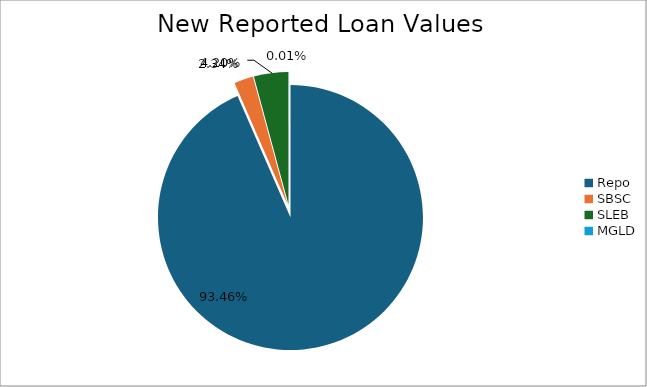
| Category | Series 0 |
|---|---|
| Repo | 9071812.226 |
| SBSC | 226806.063 |
| SLEB | 407755.747 |
| MGLD | 491.934 |